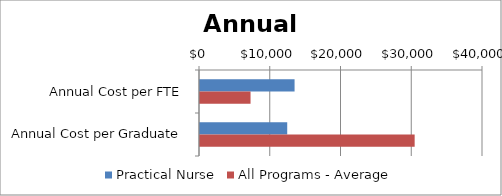
| Category | Practical Nurse | All Programs - Average |
|---|---|---|
| Annual Cost per FTE | 13366.892 | 7144 |
| Annual Cost per Graduate | 12327.245 | 30340 |